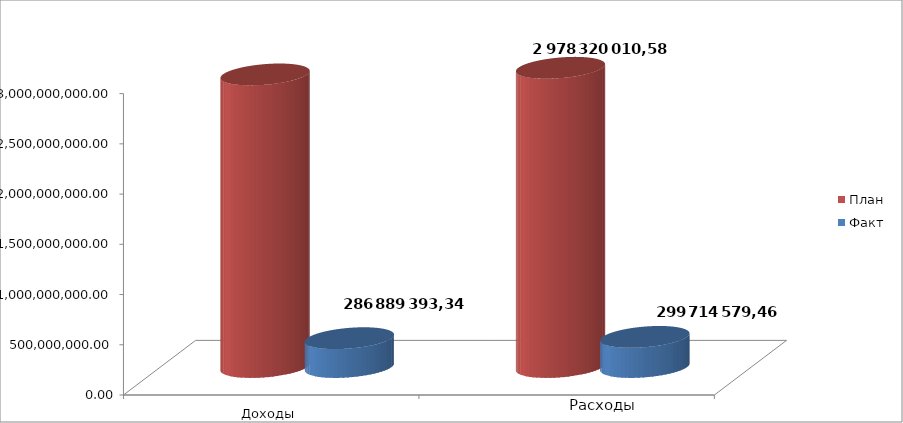
| Category | План | Факт |
|---|---|---|
| 0 | 2912236991.7 | 286889393.34 |
| 1 | 2978320010.58 | 299714579.46 |